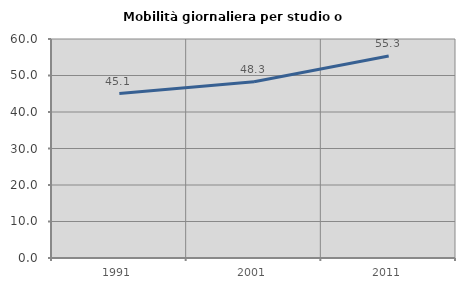
| Category | Mobilità giornaliera per studio o lavoro |
|---|---|
| 1991.0 | 45.063 |
| 2001.0 | 48.291 |
| 2011.0 | 55.315 |